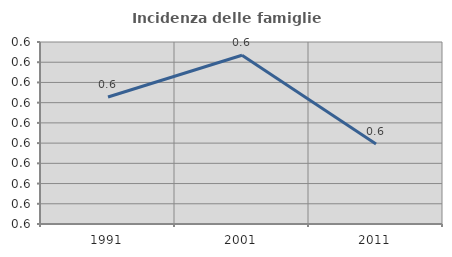
| Category | Incidenza delle famiglie numerose |
|---|---|
| 1991.0 | 0.581 |
| 2001.0 | 0.592 |
| 2011.0 | 0.57 |